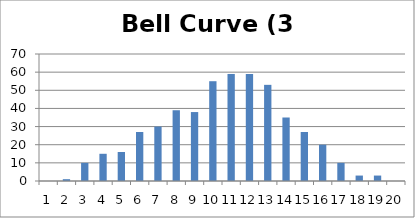
| Category | Bell Curve (3 dice) |
|---|---|
| 0 | 0 |
| 1 | 1 |
| 2 | 10 |
| 3 | 15 |
| 4 | 16 |
| 5 | 27 |
| 6 | 30 |
| 7 | 39 |
| 8 | 38 |
| 9 | 55 |
| 10 | 59 |
| 11 | 59 |
| 12 | 53 |
| 13 | 35 |
| 14 | 27 |
| 15 | 20 |
| 16 | 10 |
| 17 | 3 |
| 18 | 3 |
| 19 | 0 |